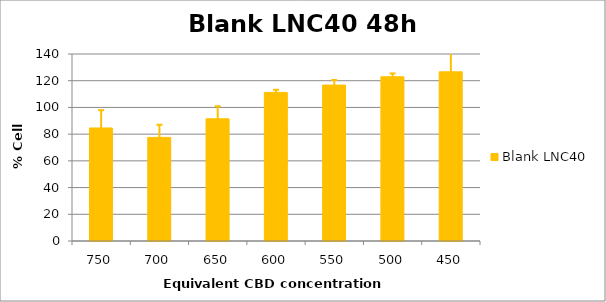
| Category | Blank LNC40 |
|---|---|
| 750.0 | 84.612 |
| 700.0 | 77.571 |
| 650.0 | 91.502 |
| 600.0 | 111.248 |
| 550.0 | 116.713 |
| 500.0 | 122.951 |
| 450.0 | 126.665 |